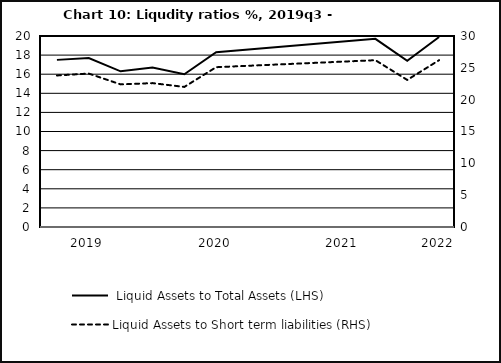
| Category |  Liquid Assets to Total Assets (LHS) |
|---|---|
| nan | 17.5 |
| 2019.0 | 17.7 |
| nan | 16.3 |
| nan | 16.7 |
| nan | 16 |
| 2020.0 | 18.3 |
| nan | 0 |
| nan | 0 |
| nan | 0 |
| 2021.0 | 0 |
| nan | 19.7 |
| nan | 17.4 |
| 2022.0 | 19.9 |